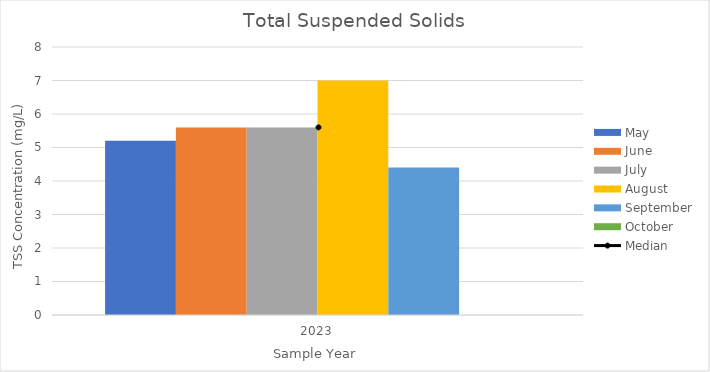
| Category | May | June | July | August | September | October |
|---|---|---|---|---|---|---|
| 2023.0 | 5.2 | 5.6 | 5.6 | 7 | 4.4 | 0 |